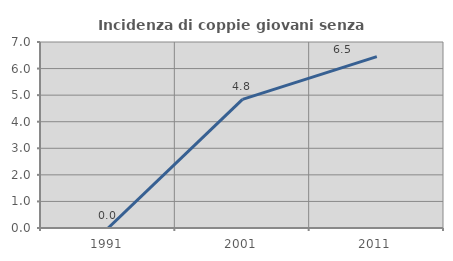
| Category | Incidenza di coppie giovani senza figli |
|---|---|
| 1991.0 | 0 |
| 2001.0 | 4.839 |
| 2011.0 | 6.452 |